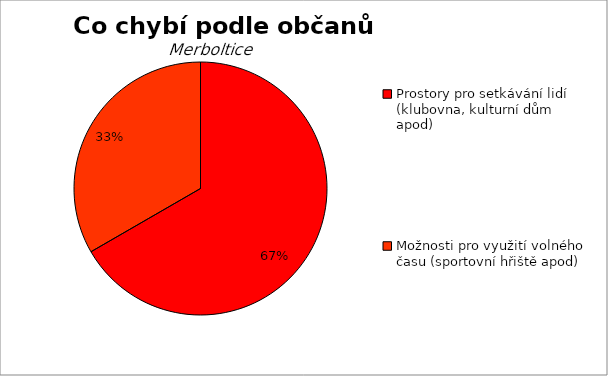
| Category | Series 0 |
|---|---|
| Prostory pro setkávání lidí (klubovna, kulturní dům apod) | 2 |
| Možnosti pro využití volného času (sportovní hřiště apod) | 1 |